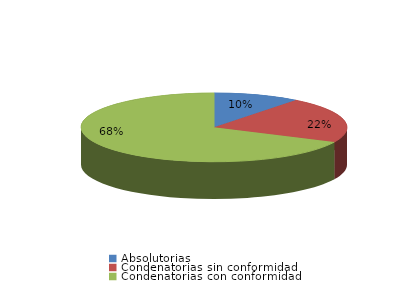
| Category | Series 0 |
|---|---|
| Absolutorias | 16 |
| Condenatorias sin conformidad | 33 |
| Condenatorias con conformidad | 104 |